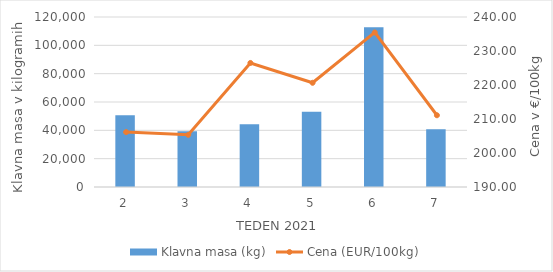
| Category | Klavna masa (kg) |
|---|---|
| 2.0 | 50603 |
| 3.0 | 39295 |
| 4.0 | 44250 |
| 5.0 | 53061 |
| 6.0 | 112816 |
| 7.0 | 40829 |